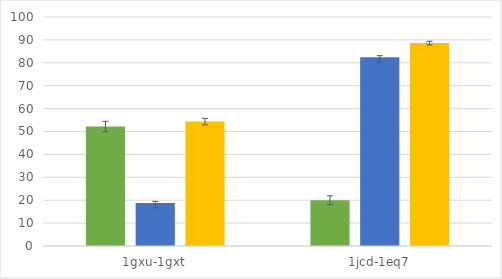
| Category | MD | Backrub | KIC |
|---|---|---|---|
| 1gxu-1gxt | 52.159 | 18.75 | 54.318 |
| 1jcd-1eq7 | 20 | 82.4 | 88.6 |